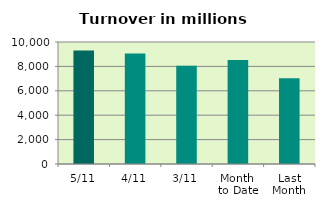
| Category | Series 0 |
|---|---|
| 5/11 | 9295.584 |
| 4/11 | 9055.063 |
| 3/11 | 8054.492 |
| Month 
to Date | 8519.718 |
| Last
Month | 7023.861 |